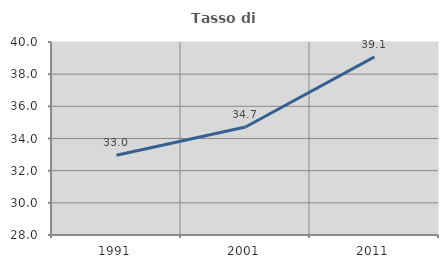
| Category | Tasso di occupazione   |
|---|---|
| 1991.0 | 32.956 |
| 2001.0 | 34.714 |
| 2011.0 | 39.074 |